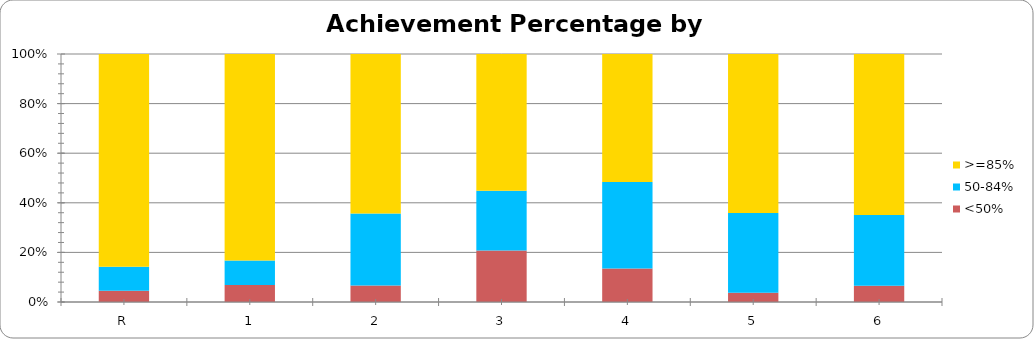
| Category | <50% | 50-84% | >=85% |
|---|---|---|---|
| R | 9 | 19 | 169 |
| 1 | 24 | 35 | 293 |
| 2 | 26 | 114 | 252 |
| 3 | 110 | 128 | 292 |
| 4 | 75 | 193 | 286 |
| 5 | 10 | 87 | 173 |
| 6 | 15 | 65 | 148 |